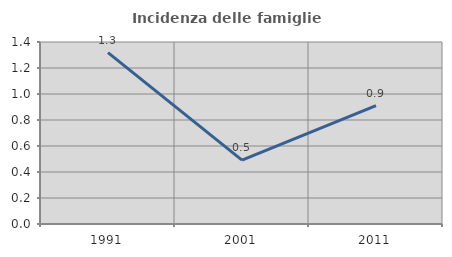
| Category | Incidenza delle famiglie numerose |
|---|---|
| 1991.0 | 1.318 |
| 2001.0 | 0.491 |
| 2011.0 | 0.91 |